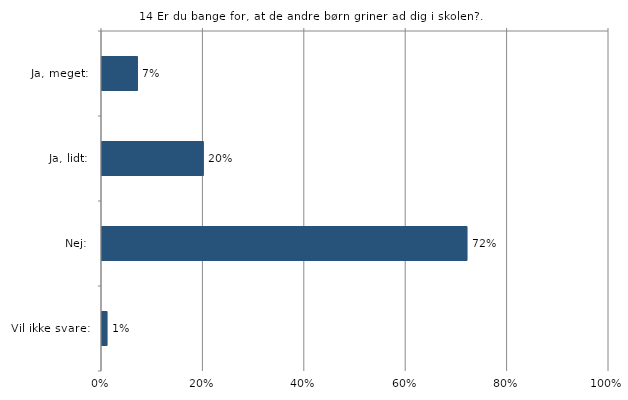
| Category | Er du bange for, at de andre børn griner ad dig i skolen? |
|---|---|
| Ja, meget:  | 0.07 |
| Ja, lidt:  | 0.2 |
| Nej:  | 0.72 |
| Vil ikke svare:  | 0.01 |